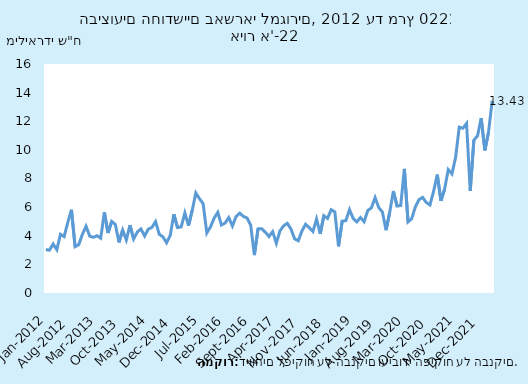
| Category | ביצועים |
|---|---|
| 2012-01-31 | 3.033 |
| 2012-02-29 | 2.993 |
| 2012-03-31 | 3.424 |
| 2012-04-30 | 3.026 |
| 2012-05-31 | 4.102 |
| 2012-06-30 | 3.942 |
| 2012-07-31 | 4.926 |
| 2012-08-31 | 5.817 |
| 2012-09-30 | 3.235 |
| 2012-10-31 | 3.379 |
| 2012-11-30 | 4.101 |
| 2012-12-31 | 4.664 |
| 2013-01-31 | 3.971 |
| 2013-02-28 | 3.893 |
| 2013-03-31 | 4 |
| 2013-04-30 | 3.831 |
| 2013-05-31 | 5.645 |
| 2013-06-30 | 4.193 |
| 2013-07-31 | 5.002 |
| 2013-08-31 | 4.786 |
| 2013-09-30 | 3.533 |
| 2013-10-31 | 4.404 |
| 2013-11-30 | 3.704 |
| 2013-12-31 | 4.743 |
| 2014-01-31 | 3.772 |
| 2014-02-28 | 4.262 |
| 2014-03-31 | 4.474 |
| 2014-04-30 | 3.983 |
| 2014-05-31 | 4.456 |
| 2014-06-30 | 4.583 |
| 2014-07-31 | 4.991 |
| 2014-08-31 | 4.107 |
| 2014-09-30 | 3.921 |
| 2014-10-31 | 3.514 |
| 2014-11-30 | 4.028 |
| 2014-12-31 | 5.504 |
| 2015-01-31 | 4.572 |
| 2015-02-28 | 4.621 |
| 2015-03-31 | 5.598 |
| 2015-04-30 | 4.706 |
| 2015-05-31 | 5.758 |
| 2015-06-30 | 6.99 |
| 2015-07-31 | 6.59 |
| 2015-08-31 | 6.239 |
| 2015-09-30 | 4.194 |
| 2015-10-31 | 4.615 |
| 2015-11-30 | 5.225 |
| 2015-12-31 | 5.635 |
| 2016-01-31 | 4.75 |
| 2016-02-29 | 4.888 |
| 2016-03-31 | 5.27 |
| 2016-04-30 | 4.682 |
| 2016-05-31 | 5.341 |
| 2016-06-30 | 5.578 |
| 2016-07-31 | 5.353 |
| 2016-08-31 | 5.242 |
| 2016-09-30 | 4.732 |
| 2016-10-31 | 2.648 |
| 2016-11-30 | 4.481 |
| 2016-12-31 | 4.49 |
| 2017-01-31 | 4.248 |
| 2017-02-28 | 3.944 |
| 2017-03-31 | 4.289 |
| 2017-04-30 | 3.474 |
| 2017-05-31 | 4.343 |
| 2017-06-30 | 4.695 |
| 2017-07-31 | 4.872 |
| 2017-08-31 | 4.469 |
| 2017-09-30 | 3.789 |
| 2017-10-31 | 3.648 |
| 2017-11-30 | 4.335 |
| 2017-12-31 | 4.803 |
| 2018-01-31 | 4.559 |
| 2018-02-28 | 4.296 |
| 2018-03-31 | 5.173 |
| 2018-04-30 | 4.133 |
| 2018-05-31 | 5.4 |
| 2018-06-30 | 5.211 |
| 2018-07-31 | 5.821 |
| 2018-08-31 | 5.667 |
| 2018-09-30 | 3.262 |
| 2018-10-31 | 5.019 |
| 2018-11-30 | 5.056 |
| 2018-12-31 | 5.829 |
| 2019-01-31 | 5.21 |
| 2019-02-28 | 4.966 |
| 2019-03-31 | 5.276 |
| 2019-04-30 | 4.98 |
| 2019-05-31 | 5.764 |
| 2019-06-30 | 5.954 |
| 2019-07-31 | 6.666 |
| 2019-08-31 | 5.967 |
| 2019-09-30 | 5.657 |
| 2019-10-31 | 4.389 |
| 2019-11-30 | 5.65 |
| 2019-12-31 | 7.121 |
| 2020-01-31 | 6.074 |
| 2020-02-29 | 6.112 |
| 2020-03-31 | 8.672 |
| 2020-04-30 | 4.965 |
| 2020-05-31 | 5.191 |
| 2020-06-30 | 6.014 |
| 2020-07-31 | 6.529 |
| 2020-08-31 | 6.681 |
| 2020-09-30 | 6.32 |
| 2020-10-31 | 6.151 |
| 2020-11-30 | 7.117 |
| 2020-12-31 | 8.271 |
| 2021-01-31 | 6.44 |
| 2021-02-28 | 7.263 |
| 2021-03-31 | 8.624 |
| 2021-04-30 | 8.323 |
| 2021-05-31 | 9.473 |
| 2021-06-30 | 11.588 |
| 2021-07-31 | 11.512 |
| 2021-08-31 | 11.849 |
| 2021-09-30 | 7.128 |
| 2021-10-31 | 10.688 |
| 2021-11-30 | 10.984 |
| 2021-12-31 | 12.219 |
| 2022-01-31 | 9.966 |
| 2022-02-28 | 11.225 |
| 2022-03-31 | 13.432 |